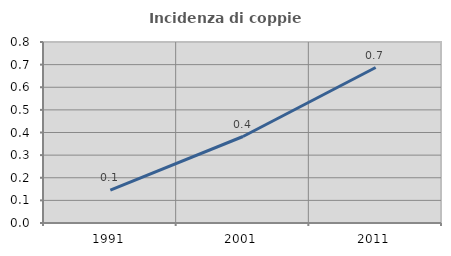
| Category | Incidenza di coppie miste |
|---|---|
| 1991.0 | 0.145 |
| 2001.0 | 0.382 |
| 2011.0 | 0.687 |